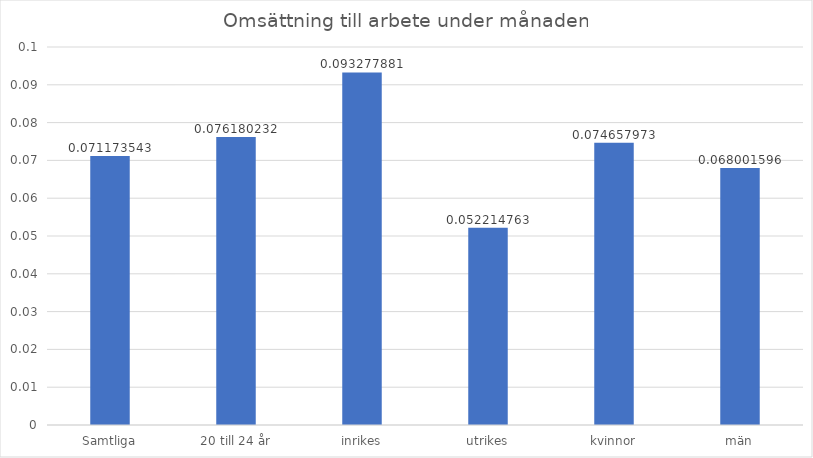
| Category | Series 0 |
|---|---|
| Samtliga | 0.071 |
| 20 till 24 år | 0.076 |
| inrikes | 0.093 |
| utrikes | 0.052 |
| kvinnor | 0.075 |
| män | 0.068 |